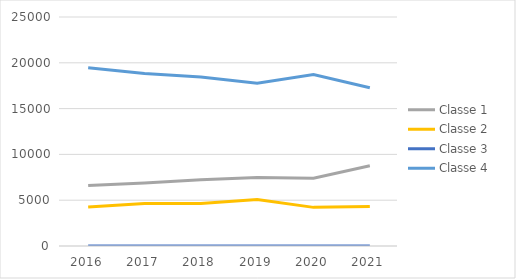
| Category | Classe 1   | Classe 2 | Classe 3 | Classe 4 |
|---|---|---|---|---|
| 2016.0 | 6601 | 4267 | 6 | 19471 |
| 2017.0 | 6867 | 4643 | 7 | 18827 |
| 2018.0 | 7234 | 4643 | 7 | 18461 |
| 2019.0 | 7488 | 5080 | 9 | 17768 |
| 2020.0 | 7399 | 4217 | 9 | 18720 |
| 2021.0 | 8759 | 4306 | 10 | 17270 |